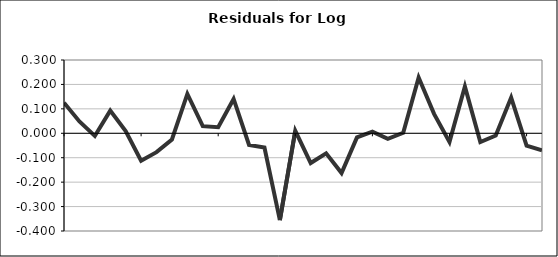
| Category | Series 0 |
|---|---|
| 0 | 0.125 |
| 1 | 0.049 |
| 2 | -0.011 |
| 3 | 0.093 |
| 4 | 0.009 |
| 5 | -0.112 |
| 6 | -0.077 |
| 7 | -0.025 |
| 8 | 0.161 |
| 9 | 0.029 |
| 10 | 0.025 |
| 11 | 0.141 |
| 12 | -0.048 |
| 13 | -0.059 |
| 14 | -0.355 |
| 15 | 0.01 |
| 16 | -0.122 |
| 17 | -0.082 |
| 18 | -0.163 |
| 19 | -0.017 |
| 20 | 0.007 |
| 21 | -0.023 |
| 22 | 0.002 |
| 23 | 0.228 |
| 24 | 0.079 |
| 25 | -0.036 |
| 26 | 0.191 |
| 27 | -0.036 |
| 28 | -0.009 |
| 29 | 0.146 |
| 30 | -0.05 |
| 31 | -0.069 |